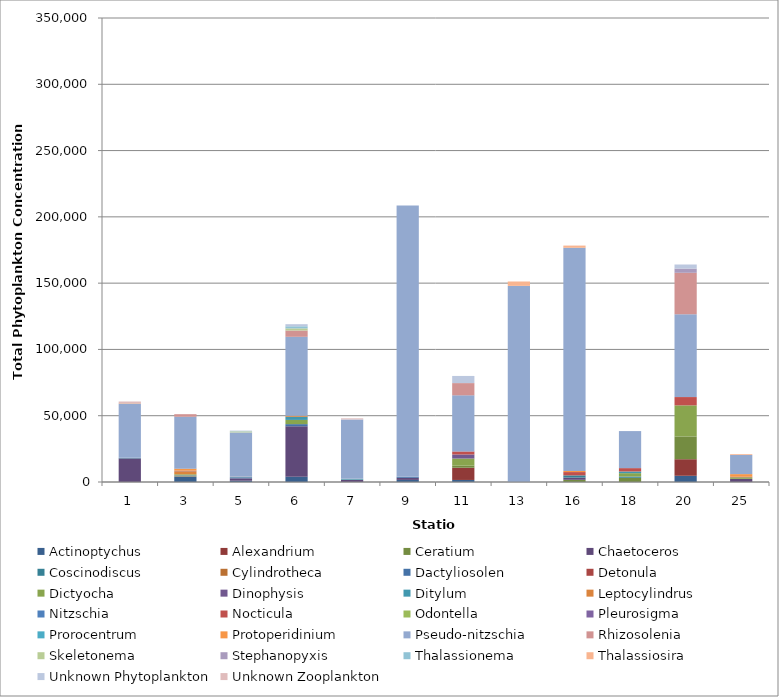
| Category | Actinoptychus | Alexandrium | Ceratium | Chaetoceros | Coscinodiscus | Cylindrotheca | Dactyliosolen | Detonula | Dictyocha | Dinophysis | Ditylum | Leptocylindrus | Nitzschia | Nocticula | Odontella | Pleurosigma | Prorocentrum | Protoperidinium | Pseudo-nitzschia | Rhizosolenia | Skeletonema | Stephanopyxis | Thalassionema | Thalassiosira | Unknown Phytoplankton | Unknown Zooplankton |
|---|---|---|---|---|---|---|---|---|---|---|---|---|---|---|---|---|---|---|---|---|---|---|---|---|---|---|
| 1.0 | 0 | 0 | 0 | 17857 | 0 | 0 | 0 | 0 | 0 | 0 | 396 | 0 | 0 | 0 | 0 | 0 | 0 | 0 | 40873 | 0 | 0 | 0 | 0 | 396 | 0 | 1190 |
| 3.0 | 3875 | 0 | 0 | 0 | 387 | 387 | 387 | 0 | 775 | 0 | 0 | 2325 | 0 | 0 | 0 | 387 | 0 | 1550 | 39147 | 1937 | 0 | 0 | 0 | 0 | 0 | 0 |
| 5.0 | 984 | 0 | 0 | 1771 | 0 | 0 | 787 | 0 | 0 | 0 | 196 | 0 | 0 | 0 | 0 | 0 | 0 | 196 | 33464 | 0 | 787 | 0 | 196 | 0 | 393 | 0 |
| 6.0 | 3968 | 0 | 0 | 38095 | 0 | 0 | 1587 | 0 | 3174 | 0 | 2380 | 793 | 0 | 0 | 0 | 0 | 0 | 0 | 59523 | 4761 | 1587 | 0 | 1587 | 0 | 1587 | 0 |
| 7.0 | 0 | 0 | 0 | 1587 | 396 | 0 | 0 | 0 | 0 | 0 | 396 | 0 | 0 | 0 | 0 | 0 | 0 | 0 | 44841 | 0 | 0 | 0 | 0 | 0 | 0 | 793 |
| 9.0 | 1574 | 0 | 0 | 1574 | 0 | 0 | 787 | 0 | 0 | 0 | 0 | 0 | 0 | 0 | 0 | 0 | 0 | 0 | 204724 | 0 | 0 | 0 | 0 | 0 | 0 | 0 |
| 11.0 | 1538 | 9230 | 1538 | 0 | 0 | 0 | 0 | 0 | 5384 | 3076 | 0 | 0 | 0 | 2307 | 0 | 0 | 0 | 0 | 42307 | 9230 | 0 | 0 | 0 | 0 | 5384 | 0 |
| 13.0 | 0 | 0 | 0 | 0 | 0 | 0 | 0 | 0 | 0 | 0 | 0 | 0 | 0 | 0 | 0 | 0 | 0 | 0 | 147933 | 0 | 0 | 0 | 0 | 3305 | 0 | 0 |
| 16.0 | 0 | 0 | 1666 | 1666 | 1666 | 0 | 0 | 0 | 0 | 0 | 0 | 0 | 0 | 2500 | 0 | 0 | 0 | 833 | 168333 | 0 | 0 | 0 | 0 | 1666 | 0 | 0 |
| 18.0 | 0 | 0 | 3174 | 0 | 952 | 0 | 0 | 0 | 2539 | 0 | 1269 | 0 | 0 | 2539 | 0 | 0 | 0 | 0 | 27936 | 0 | 0 | 0 | 0 | 0 | 0 | 0 |
| 20.0 | 4687 | 12500 | 17187 | 0 | 0 | 0 | 0 | 0 | 23437 | 0 | 0 | 0 | 0 | 6250 | 0 | 0 | 0 | 0 | 62500 | 31250 | 0 | 3125 | 0 | 0 | 3125 | 0 |
| 25.0 | 0 | 0 | 0 | 2380 | 0 | 0 | 0 | 0 | 1190 | 0 | 0 | 0 | 0 | 396 | 0 | 0 | 0 | 1984 | 14484 | 0 | 0 | 0 | 0 | 595 | 0 | 0 |